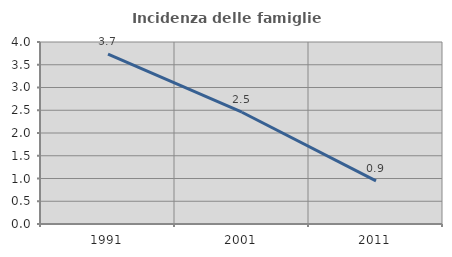
| Category | Incidenza delle famiglie numerose |
|---|---|
| 1991.0 | 3.734 |
| 2001.0 | 2.457 |
| 2011.0 | 0.947 |